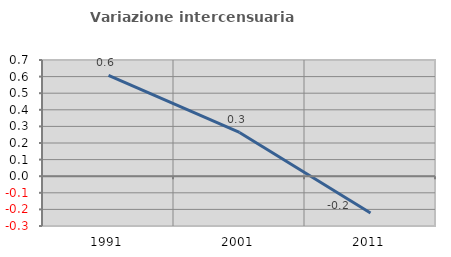
| Category | Variazione intercensuaria annua |
|---|---|
| 1991.0 | 0.608 |
| 2001.0 | 0.263 |
| 2011.0 | -0.221 |